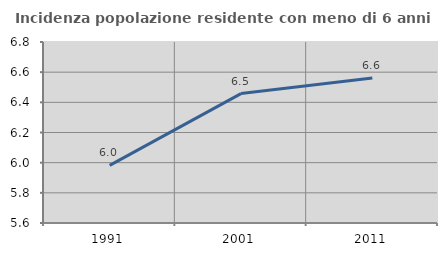
| Category | Incidenza popolazione residente con meno di 6 anni |
|---|---|
| 1991.0 | 5.982 |
| 2001.0 | 6.458 |
| 2011.0 | 6.561 |